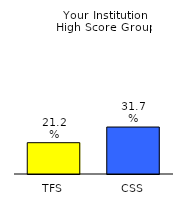
| Category | Series 0 |
|---|---|
| TFS | 0.212 |
| CSS | 0.317 |